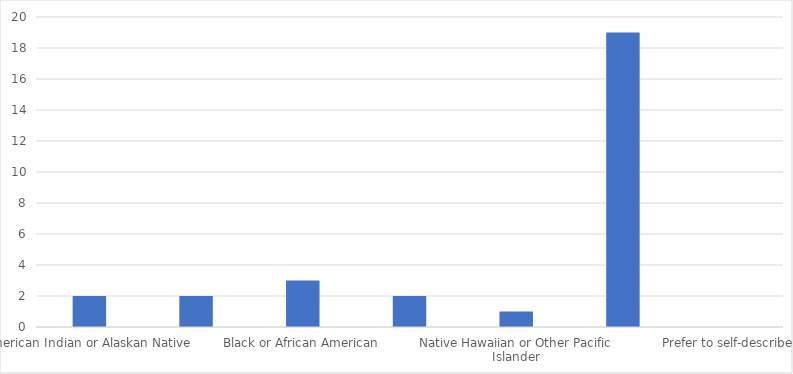
| Category | Number of Responses |
|---|---|
| American Indian or Alaskan Native | 2 |
| Asian | 2 |
| Black or African American | 3 |
| Hispanic or Latino/a/x | 2 |
| Native Hawaiian or Other Pacific Islander | 1 |
| White | 19 |
| Prefer to self-describe | 0 |